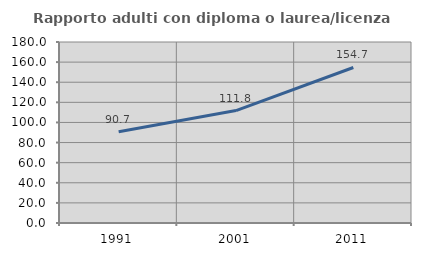
| Category | Rapporto adulti con diploma o laurea/licenza media  |
|---|---|
| 1991.0 | 90.664 |
| 2001.0 | 111.825 |
| 2011.0 | 154.673 |